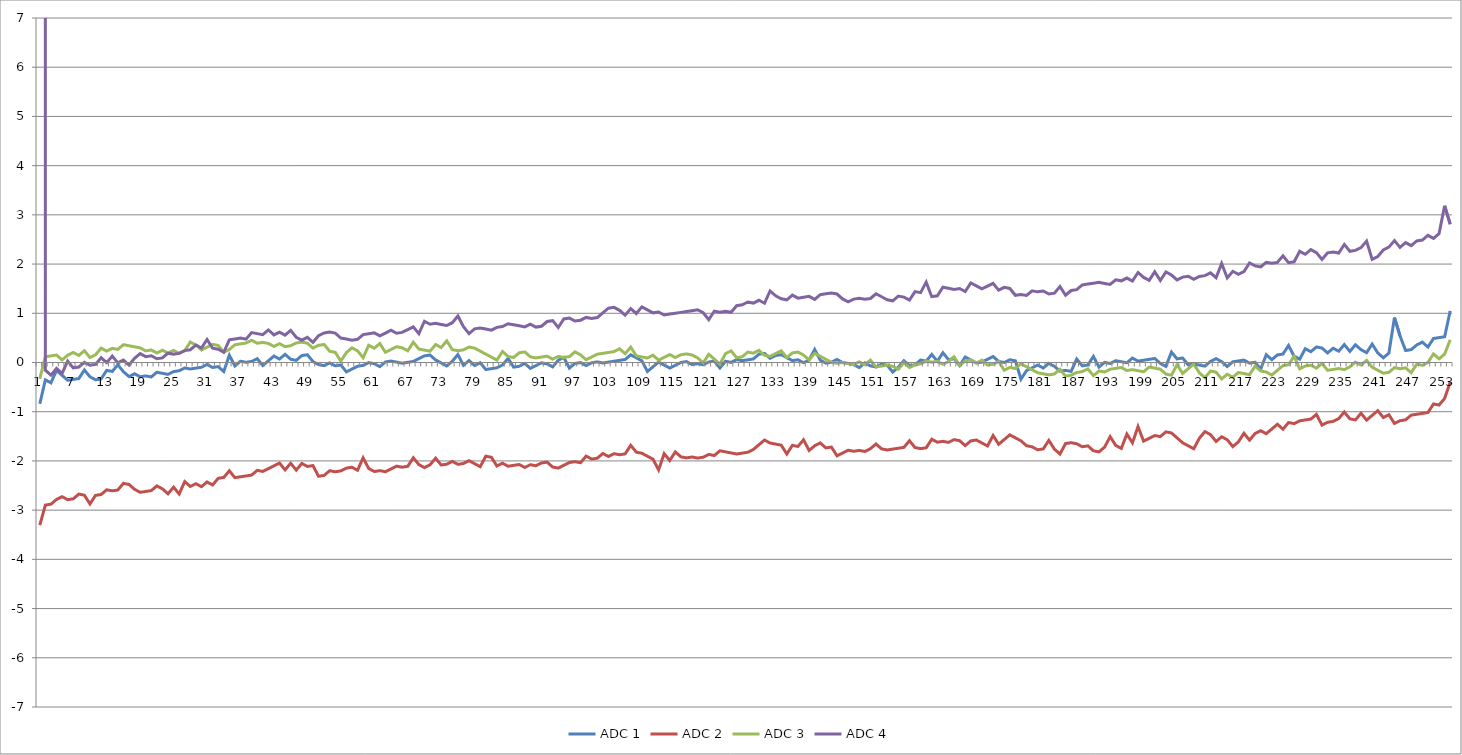
| Category | ADC 1 | ADC 2 | ADC 3 | ADC 4 |
|---|---|---|---|---|
| 0 | -0.84 | -3.305 | -0.331 | 3349.703 |
| 1 | -0.353 | -2.897 | 0.117 | -0.157 |
| 2 | -0.414 | -2.879 | 0.134 | -0.257 |
| 3 | -0.161 | -2.783 | 0.152 | -0.122 |
| 4 | -0.261 | -2.727 | 0.052 | -0.222 |
| 5 | -0.361 | -2.787 | 0.148 | 0.03 |
| 6 | -0.343 | -2.77 | 0.204 | -0.109 |
| 7 | -0.326 | -2.674 | 0.144 | -0.091 |
| 8 | -0.152 | -2.696 | 0.239 | 0.005 |
| 9 | -0.291 | -2.874 | 0.1 | -0.056 |
| 10 | -0.352 | -2.7 | 0.157 | -0.039 |
| 11 | -0.334 | -2.682 | 0.292 | 0.096 |
| 12 | -0.16 | -2.586 | 0.231 | -0.004 |
| 13 | -0.182 | -2.608 | 0.288 | 0.131 |
| 14 | -0.047 | -2.591 | 0.266 | -0.008 |
| 15 | -0.186 | -2.456 | 0.362 | 0.049 |
| 16 | -0.286 | -2.477 | 0.341 | -0.051 |
| 17 | -0.229 | -2.577 | 0.319 | 0.084 |
| 18 | -0.29 | -2.638 | 0.297 | 0.18 |
| 19 | -0.272 | -2.62 | 0.237 | 0.119 |
| 20 | -0.294 | -2.603 | 0.254 | 0.137 |
| 21 | -0.198 | -2.507 | 0.193 | 0.076 |
| 22 | -0.22 | -2.568 | 0.25 | 0.093 |
| 23 | -0.241 | -2.668 | 0.189 | 0.189 |
| 24 | -0.185 | -2.533 | 0.246 | 0.168 |
| 25 | -0.167 | -2.672 | 0.185 | 0.185 |
| 26 | -0.11 | -2.419 | 0.242 | 0.242 |
| 27 | -0.132 | -2.519 | 0.416 | 0.259 |
| 28 | -0.115 | -2.463 | 0.355 | 0.355 |
| 29 | -0.097 | -2.523 | 0.255 | 0.294 |
| 30 | -0.04 | -2.428 | 0.312 | 0.468 |
| 31 | -0.101 | -2.488 | 0.369 | 0.29 |
| 32 | -0.084 | -2.353 | 0.347 | 0.269 |
| 33 | -0.183 | -2.336 | 0.208 | 0.208 |
| 34 | 0.147 | -2.201 | 0.265 | 0.46 |
| 35 | -0.07 | -2.34 | 0.36 | 0.478 |
| 36 | 0.026 | -2.322 | 0.378 | 0.495 |
| 37 | 0.004 | -2.305 | 0.395 | 0.474 |
| 38 | 0.022 | -2.287 | 0.452 | 0.609 |
| 39 | 0.078 | -2.192 | 0.391 | 0.587 |
| 40 | -0.061 | -2.213 | 0.409 | 0.565 |
| 41 | 0.035 | -2.157 | 0.387 | 0.661 |
| 42 | 0.131 | -2.1 | 0.326 | 0.561 |
| 43 | 0.07 | -2.043 | 0.383 | 0.618 |
| 44 | 0.166 | -2.182 | 0.322 | 0.557 |
| 45 | 0.066 | -2.047 | 0.34 | 0.653 |
| 46 | 0.044 | -2.186 | 0.397 | 0.514 |
| 47 | 0.14 | -2.051 | 0.414 | 0.453 |
| 48 | 0.158 | -2.112 | 0.392 | 0.51 |
| 49 | 0.019 | -2.095 | 0.293 | 0.41 |
| 50 | -0.042 | -2.312 | 0.349 | 0.545 |
| 51 | -0.064 | -2.294 | 0.367 | 0.602 |
| 52 | -0.007 | -2.199 | 0.228 | 0.619 |
| 53 | -0.068 | -2.22 | 0.206 | 0.597 |
| 54 | -0.05 | -2.203 | 0.028 | 0.498 |
| 55 | -0.189 | -2.146 | 0.202 | 0.476 |
| 56 | -0.133 | -2.129 | 0.298 | 0.454 |
| 57 | -0.076 | -2.189 | 0.237 | 0.472 |
| 58 | -0.058 | -1.937 | 0.098 | 0.568 |
| 59 | -0.002 | -2.154 | 0.35 | 0.585 |
| 60 | -0.023 | -2.215 | 0.29 | 0.603 |
| 61 | -0.084 | -2.198 | 0.385 | 0.542 |
| 62 | 0.012 | -2.219 | 0.207 | 0.599 |
| 63 | 0.029 | -2.162 | 0.264 | 0.655 |
| 64 | 0.008 | -2.106 | 0.321 | 0.595 |
| 65 | -0.014 | -2.127 | 0.299 | 0.612 |
| 66 | 0.003 | -2.11 | 0.238 | 0.669 |
| 67 | 0.021 | -1.936 | 0.412 | 0.725 |
| 68 | 0.078 | -2.075 | 0.273 | 0.586 |
| 69 | 0.134 | -2.136 | 0.252 | 0.839 |
| 70 | 0.152 | -2.079 | 0.23 | 0.778 |
| 71 | 0.052 | -1.944 | 0.365 | 0.795 |
| 72 | -0.009 | -2.083 | 0.304 | 0.774 |
| 73 | -0.07 | -2.066 | 0.439 | 0.752 |
| 74 | 0.026 | -2.009 | 0.261 | 0.809 |
| 75 | 0.161 | -2.07 | 0.239 | 0.944 |
| 76 | -0.056 | -2.052 | 0.257 | 0.727 |
| 77 | 0.04 | -1.995 | 0.314 | 0.588 |
| 78 | -0.06 | -2.056 | 0.292 | 0.683 |
| 79 | -0.004 | -2.117 | 0.231 | 0.701 |
| 80 | -0.143 | -1.904 | 0.17 | 0.679 |
| 81 | -0.125 | -1.925 | 0.11 | 0.658 |
| 82 | -0.108 | -2.103 | 0.049 | 0.714 |
| 83 | -0.051 | -2.047 | 0.223 | 0.732 |
| 84 | 0.084 | -2.108 | 0.123 | 0.788 |
| 85 | -0.094 | -2.09 | 0.102 | 0.767 |
| 86 | -0.077 | -2.073 | 0.197 | 0.745 |
| 87 | -0.02 | -2.133 | 0.215 | 0.724 |
| 88 | -0.12 | -2.077 | 0.115 | 0.78 |
| 89 | -0.063 | -2.098 | 0.093 | 0.72 |
| 90 | -0.007 | -2.042 | 0.111 | 0.737 |
| 91 | -0.028 | -2.024 | 0.128 | 0.833 |
| 92 | -0.089 | -2.124 | 0.068 | 0.85 |
| 93 | 0.046 | -2.146 | 0.124 | 0.711 |
| 94 | 0.103 | -2.089 | 0.103 | 0.885 |
| 95 | -0.115 | -2.032 | 0.12 | 0.903 |
| 96 | -0.019 | -2.015 | 0.216 | 0.842 |
| 97 | -0.001 | -2.036 | 0.155 | 0.86 |
| 98 | -0.062 | -1.901 | 0.055 | 0.916 |
| 99 | -0.005 | -1.962 | 0.112 | 0.895 |
| 100 | 0.012 | -1.945 | 0.169 | 0.912 |
| 101 | -0.009 | -1.849 | 0.186 | 1.008 |
| 102 | 0.008 | -1.91 | 0.204 | 1.104 |
| 103 | 0.026 | -1.853 | 0.221 | 1.121 |
| 104 | 0.043 | -1.875 | 0.278 | 1.061 |
| 105 | 0.061 | -1.857 | 0.178 | 0.961 |
| 106 | 0.156 | -1.683 | 0.313 | 1.096 |
| 107 | 0.096 | -1.822 | 0.135 | 0.996 |
| 108 | 0.035 | -1.844 | 0.113 | 1.131 |
| 109 | -0.182 | -1.904 | 0.092 | 1.07 |
| 110 | -0.087 | -1.965 | 0.148 | 1.009 |
| 111 | 0.009 | -2.182 | 0.048 | 1.027 |
| 112 | -0.052 | -1.852 | 0.105 | 0.966 |
| 113 | -0.112 | -1.991 | 0.162 | 0.983 |
| 114 | -0.056 | -1.817 | 0.101 | 1.001 |
| 115 | 0.001 | -1.917 | 0.158 | 1.019 |
| 116 | 0.019 | -1.938 | 0.175 | 1.036 |
| 117 | -0.042 | -1.921 | 0.153 | 1.054 |
| 118 | -0.025 | -1.942 | 0.093 | 1.071 |
| 119 | -0.046 | -1.925 | -0.007 | 1.01 |
| 120 | 0.01 | -1.868 | 0.167 | 0.871 |
| 121 | 0.028 | -1.89 | 0.067 | 1.045 |
| 122 | -0.111 | -1.794 | -0.033 | 1.024 |
| 123 | 0.024 | -1.816 | 0.18 | 1.041 |
| 124 | 0.002 | -1.837 | 0.237 | 1.02 |
| 125 | 0.059 | -1.859 | 0.098 | 1.155 |
| 126 | 0.037 | -1.841 | 0.115 | 1.172 |
| 127 | 0.055 | -1.824 | 0.211 | 1.229 |
| 128 | 0.072 | -1.767 | 0.19 | 1.207 |
| 129 | 0.168 | -1.671 | 0.246 | 1.264 |
| 130 | 0.186 | -1.576 | 0.146 | 1.203 |
| 131 | 0.086 | -1.636 | 0.125 | 1.455 |
| 132 | 0.142 | -1.658 | 0.181 | 1.356 |
| 133 | 0.16 | -1.68 | 0.238 | 1.295 |
| 134 | 0.099 | -1.858 | 0.099 | 1.273 |
| 135 | 0.038 | -1.684 | 0.195 | 1.369 |
| 136 | 0.056 | -1.705 | 0.212 | 1.308 |
| 137 | -0.005 | -1.57 | 0.152 | 1.326 |
| 138 | 0.052 | -1.788 | 0.052 | 1.343 |
| 139 | 0.265 | -1.692 | 0.187 | 1.283 |
| 140 | 0.048 | -1.635 | 0.126 | 1.378 |
| 141 | -0.013 | -1.735 | 0.065 | 1.396 |
| 142 | 0.004 | -1.717 | 0.004 | 1.413 |
| 143 | 0.061 | -1.896 | -0.017 | 1.392 |
| 144 | 0 | -1.839 | 0 | 1.292 |
| 145 | -0.021 | -1.782 | -0.021 | 1.231 |
| 146 | -0.043 | -1.804 | -0.043 | 1.288 |
| 147 | -0.104 | -1.786 | 0.014 | 1.305 |
| 148 | -0.008 | -1.808 | -0.047 | 1.284 |
| 149 | -0.069 | -1.751 | 0.049 | 1.301 |
| 150 | -0.09 | -1.656 | -0.09 | 1.397 |
| 151 | -0.033 | -1.755 | -0.073 | 1.336 |
| 152 | -0.055 | -1.777 | -0.055 | 1.275 |
| 153 | -0.194 | -1.76 | -0.077 | 1.254 |
| 154 | -0.098 | -1.742 | -0.137 | 1.35 |
| 155 | 0.037 | -1.725 | -0.003 | 1.328 |
| 156 | -0.063 | -1.59 | -0.102 | 1.267 |
| 157 | -0.046 | -1.729 | -0.046 | 1.441 |
| 158 | 0.05 | -1.75 | -0.028 | 1.42 |
| 159 | 0.028 | -1.733 | 0.028 | 1.633 |
| 160 | 0.163 | -1.559 | 0.007 | 1.337 |
| 161 | 0.024 | -1.619 | 0.024 | 1.355 |
| 162 | 0.198 | -1.602 | -0.036 | 1.529 |
| 163 | 0.059 | -1.623 | 0.02 | 1.507 |
| 164 | 0.077 | -1.567 | 0.116 | 1.486 |
| 165 | -0.062 | -1.588 | -0.062 | 1.503 |
| 166 | 0.112 | -1.688 | 0.034 | 1.443 |
| 167 | 0.051 | -1.593 | 0.051 | 1.617 |
| 168 | -0.01 | -1.575 | -0.01 | 1.556 |
| 169 | 0.008 | -1.636 | 0.047 | 1.495 |
| 170 | 0.065 | -1.696 | -0.053 | 1.552 |
| 171 | 0.121 | -1.483 | -0.035 | 1.608 |
| 172 | 0.021 | -1.661 | 0.021 | 1.469 |
| 173 | 0 | -1.566 | -0.157 | 1.526 |
| 174 | 0.056 | -1.47 | -0.1 | 1.504 |
| 175 | 0.035 | -1.531 | -0.122 | 1.365 |
| 176 | -0.339 | -1.591 | -0.026 | 1.383 |
| 177 | -0.165 | -1.691 | -0.087 | 1.361 |
| 178 | -0.108 | -1.713 | -0.147 | 1.457 |
| 179 | -0.052 | -1.774 | -0.208 | 1.436 |
| 180 | -0.112 | -1.756 | -0.23 | 1.453 |
| 181 | -0.017 | -1.582 | -0.251 | 1.392 |
| 182 | -0.077 | -1.76 | -0.234 | 1.41 |
| 183 | -0.177 | -1.86 | -0.138 | 1.545 |
| 184 | -0.16 | -1.647 | -0.277 | 1.367 |
| 185 | -0.181 | -1.629 | -0.26 | 1.462 |
| 186 | 0.071 | -1.651 | -0.203 | 1.48 |
| 187 | -0.068 | -1.712 | -0.185 | 1.576 |
| 188 | -0.05 | -1.694 | -0.129 | 1.593 |
| 189 | 0.124 | -1.794 | -0.268 | 1.611 |
| 190 | -0.094 | -1.816 | -0.172 | 1.628 |
| 191 | 0.002 | -1.72 | -0.194 | 1.607 |
| 192 | -0.02 | -1.507 | -0.137 | 1.585 |
| 193 | 0.037 | -1.685 | -0.119 | 1.681 |
| 194 | 0.016 | -1.746 | -0.102 | 1.659 |
| 195 | -0.006 | -1.454 | -0.163 | 1.716 |
| 196 | 0.09 | -1.632 | -0.145 | 1.655 |
| 197 | 0.029 | -1.302 | -0.167 | 1.829 |
| 198 | 0.046 | -1.597 | -0.188 | 1.729 |
| 199 | 0.064 | -1.541 | -0.093 | 1.669 |
| 200 | 0.082 | -1.484 | -0.114 | 1.843 |
| 201 | -0.018 | -1.506 | -0.136 | 1.664 |
| 202 | -0.079 | -1.41 | -0.236 | 1.839 |
| 203 | 0.212 | -1.431 | -0.257 | 1.778 |
| 204 | 0.073 | -1.531 | -0.044 | 1.678 |
| 205 | 0.091 | -1.631 | -0.222 | 1.735 |
| 206 | -0.048 | -1.692 | -0.126 | 1.752 |
| 207 | -0.031 | -1.753 | -0.031 | 1.691 |
| 208 | -0.052 | -1.539 | -0.209 | 1.748 |
| 209 | -0.074 | -1.404 | -0.309 | 1.765 |
| 210 | 0.022 | -1.465 | -0.174 | 1.822 |
| 211 | 0.079 | -1.604 | -0.195 | 1.722 |
| 212 | 0.018 | -1.508 | -0.334 | 2.014 |
| 213 | -0.082 | -1.569 | -0.239 | 1.718 |
| 214 | 0.014 | -1.708 | -0.299 | 1.853 |
| 215 | 0.031 | -1.612 | -0.204 | 1.792 |
| 216 | 0.049 | -1.438 | -0.225 | 1.849 |
| 217 | -0.012 | -1.577 | -0.247 | 2.023 |
| 218 | 0.006 | -1.442 | -0.073 | 1.962 |
| 219 | -0.133 | -1.386 | -0.173 | 1.941 |
| 220 | 0.158 | -1.447 | -0.194 | 2.036 |
| 221 | 0.058 | -1.351 | -0.255 | 2.015 |
| 222 | 0.154 | -1.255 | -0.159 | 2.032 |
| 223 | 0.171 | -1.355 | -0.063 | 2.167 |
| 224 | 0.345 | -1.22 | -0.046 | 2.028 |
| 225 | 0.128 | -1.242 | 0.128 | 2.046 |
| 226 | 0.067 | -1.185 | -0.128 | 2.259 |
| 227 | 0.281 | -1.167 | -0.072 | 2.198 |
| 228 | 0.22 | -1.15 | -0.054 | 2.294 |
| 229 | 0.316 | -1.054 | -0.115 | 2.233 |
| 230 | 0.294 | -1.271 | -0.019 | 2.094 |
| 231 | 0.194 | -1.215 | -0.158 | 2.229 |
| 232 | 0.29 | -1.197 | -0.141 | 2.247 |
| 233 | 0.229 | -1.141 | -0.123 | 2.225 |
| 234 | 0.364 | -1.006 | -0.145 | 2.399 |
| 235 | 0.225 | -1.145 | -0.088 | 2.26 |
| 236 | 0.36 | -1.166 | 0.008 | 2.278 |
| 237 | 0.26 | -1.031 | -0.053 | 2.334 |
| 238 | 0.199 | -1.17 | 0.043 | 2.469 |
| 239 | 0.374 | -1.075 | -0.096 | 2.095 |
| 240 | 0.195 | -0.979 | -0.157 | 2.152 |
| 241 | 0.095 | -1.118 | -0.218 | 2.287 |
| 242 | 0.191 | -1.061 | -0.2 | 2.344 |
| 243 | 0.913 | -1.239 | -0.104 | 2.479 |
| 244 | 0.539 | -1.183 | -0.126 | 2.34 |
| 245 | 0.244 | -1.165 | -0.108 | 2.435 |
| 246 | 0.261 | -1.069 | -0.208 | 2.375 |
| 247 | 0.357 | -1.052 | -0.034 | 2.47 |
| 248 | 0.414 | -1.034 | -0.056 | 2.488 |
| 249 | 0.314 | -1.017 | 0.001 | 2.584 |
| 250 | 0.488 | -0.843 | 0.175 | 2.523 |
| 251 | 0.506 | -0.864 | 0.075 | 2.619 |
| 252 | 0.523 | -0.729 | 0.171 | 3.184 |
| 253 | 1.049 | -0.399 | 0.462 | 2.81 |